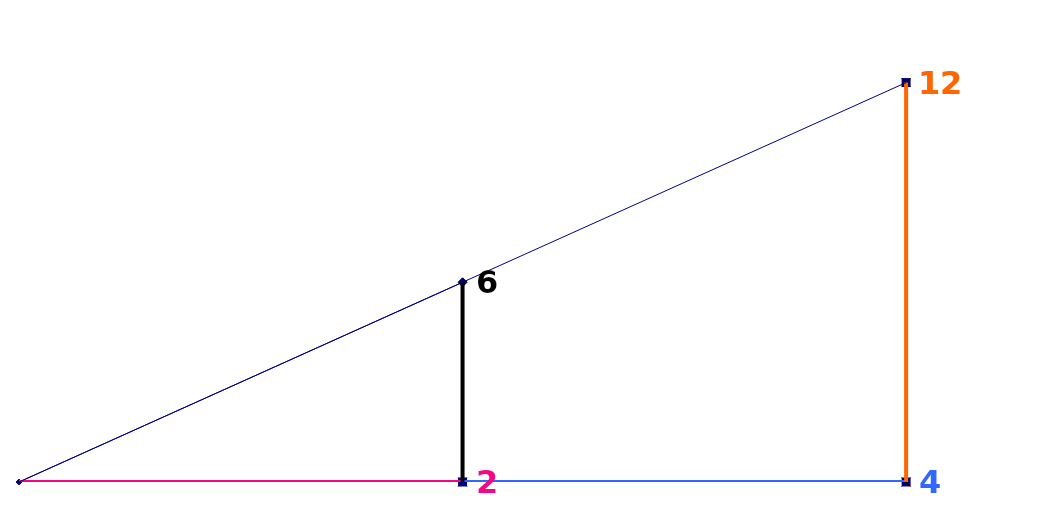
| Category | Series 0 |
|---|---|
| 0.0 | 0 |
| 4.0 | 0 |
| 4.0 | 12 |
| 0.0 | 0 |
| 0.0 | 0 |
| 2.0 | 0 |
| 2.0 | 6 |
| 0.0 | 0 |